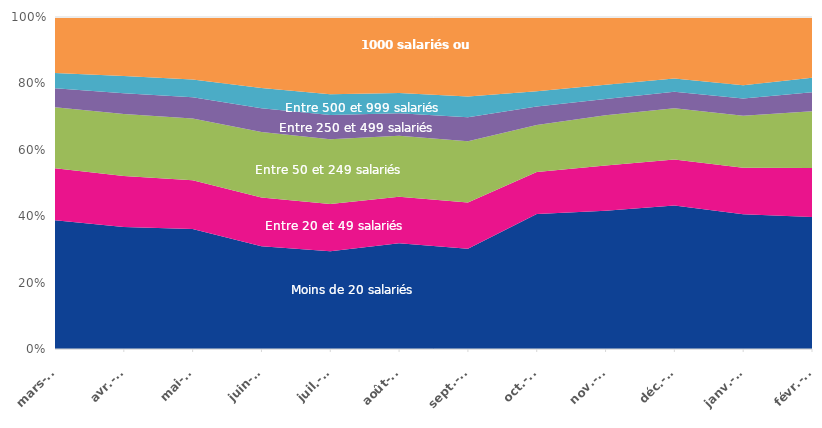
| Category | 1-Moins de 20 salariés | 2-Entre 20 et 49 salariés | 3-Entre 50 et 249 salariés | 4-Entre 250 et 499 salariés | 5-Entre 500 et 999 salariés | 6-1000 salariés ou plus |
|---|---|---|---|---|---|---|
| 2020-03-01 | 38.802 | 15.643 | 18.362 | 5.7 | 4.664 | 16.83 |
| 2020-04-01 | 36.74 | 15.381 | 18.656 | 6.279 | 5.198 | 17.746 |
| 2020-05-01 | 36.133 | 14.696 | 18.608 | 6.367 | 5.358 | 18.837 |
| 2020-06-01 | 30.971 | 14.642 | 19.723 | 7.204 | 6.09 | 21.37 |
| 2020-07-02 | 29.407 | 14.253 | 19.494 | 7.298 | 6.307 | 23.242 |
| 2020-08-03 | 31.834 | 14.011 | 18.415 | 6.784 | 6.093 | 22.863 |
| 2020-09-01 | 30.205 | 13.922 | 18.457 | 7.221 | 6.254 | 23.941 |
| 2020-10-02 | 40.63 | 12.718 | 14.098 | 5.583 | 4.637 | 22.335 |
| 2020-11-03 | 41.663 | 13.613 | 15.161 | 4.864 | 4.299 | 20.399 |
| 2020-12-04 | 43.249 | 13.831 | 15.439 | 4.943 | 4.013 | 18.524 |
| 2021-01-05 | 40.567 | 14.03 | 15.636 | 5.184 | 4.047 | 20.536 |
| 2021-02-06 | 39.775 | 14.78 | 17.037 | 5.734 | 4.395 | 18.278 |